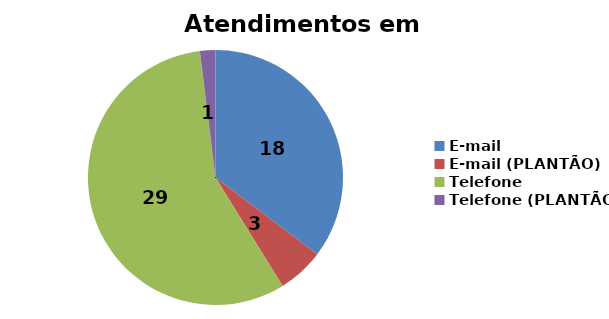
| Category | Julho  |
|---|---|
| E-mail | 18 |
| E-mail (PLANTÃO) | 3 |
| Telefone | 29 |
| Telefone (PLANTÃO) | 1 |